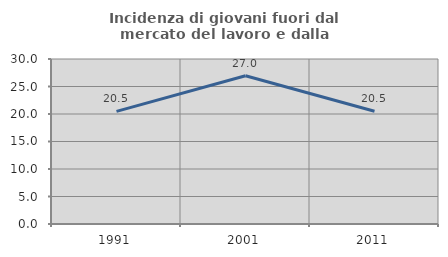
| Category | Incidenza di giovani fuori dal mercato del lavoro e dalla formazione  |
|---|---|
| 1991.0 | 20.478 |
| 2001.0 | 26.961 |
| 2011.0 | 20.513 |